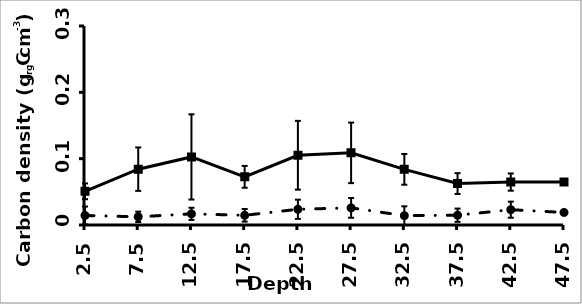
| Category | Vegetated | Unvegetated |
|---|---|---|
| 2.5 | 0.051 | 0.014 |
| 7.5 | 0.084 | 0.012 |
| 12.5 | 0.103 | 0.017 |
| 17.5 | 0.073 | 0.015 |
| 22.5 | 0.105 | 0.024 |
| 27.5 | 0.109 | 0.026 |
| 32.5 | 0.084 | 0.014 |
| 37.5 | 0.062 | 0.015 |
| 42.5 | 0.065 | 0.023 |
| 47.5 | 0.065 | 0.019 |